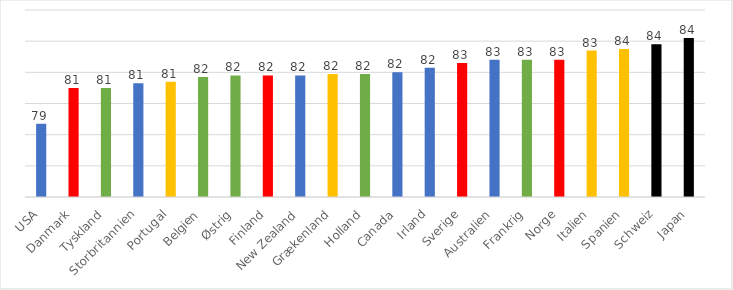
| Category | Series 0 |
|---|---|
| USA | 78.7 |
| Danmark | 81 |
| Tyskland | 81 |
| Storbritannien | 81.3 |
| Portugal | 81.4 |
| Belgien | 81.7 |
| Østrig | 81.8 |
| Finland | 81.8 |
| New Zealand | 81.8 |
| Grækenland | 81.9 |
| Holland | 81.9 |
| Canada | 82 |
| Irland | 82.3 |
| Sverige | 82.6 |
| Australien | 82.8 |
| Frankrig | 82.8 |
| Norge | 82.8 |
| Italien | 83.4 |
| Spanien | 83.5 |
| Schweiz | 83.8 |
| Japan | 84.2 |